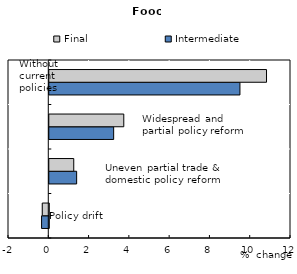
| Category | Intermediate | Final |
|---|---|---|
| Policy drift | -0.357 | -0.323 |
| Uneven partial trade & domestic policy reform | 1.358 | 1.215 |
| Widespread partial policy reform | 3.196 | 3.699 |
| Without current policies | 9.465 | 10.785 |